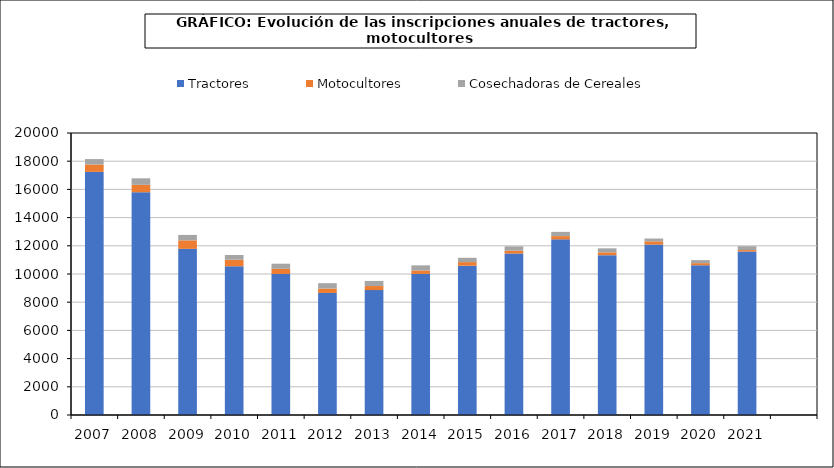
| Category | Tractores | Motocultores | Cosechadoras de Cereales |
|---|---|---|---|
| 2007.0 | 17241 | 525 | 385 |
| 2008.0 | 15799 | 525 | 463 |
| 2009.0 | 11784 | 603 | 384 |
| 2010.0 | 10548 | 463 | 336 |
| 2011.0 | 10002 | 366 | 362 |
| 2012.0 | 8655 | 315 | 380 |
| 2013.0 | 8859 | 287 | 361 |
| 2014.0 | 10004 | 248 | 360 |
| 2015.0 | 10587 | 257 | 305 |
| 2016.0 | 11449 | 209 | 302 |
| 2017.0 | 12457 | 231 | 301 |
| 2018.0 | 11333 | 204 | 284 |
| 2019.0 | 12087 | 228 | 200 |
| 2020.0 | 10620 | 150 | 215 |
| 2021.0 | 11593 | 105 | 273 |